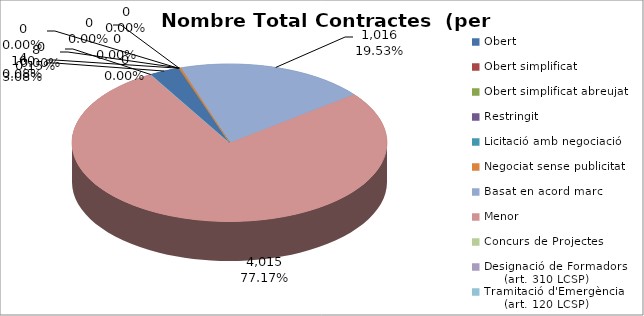
| Category | Nombre Total Contractes |
|---|---|
| Obert | 160 |
| Obert simplificat | 0 |
| Obert simplificat abreujat | 4 |
| Restringit | 0 |
| Licitació amb negociació | 0 |
| Negociat sense publicitat | 8 |
| Basat en acord marc | 1016 |
| Menor | 4015 |
| Concurs de Projectes | 0 |
| Designació de Formadors
     (art. 310 LCSP) | 0 |
| Tramitació d'Emergència
     (art. 120 LCSP) | 0 |